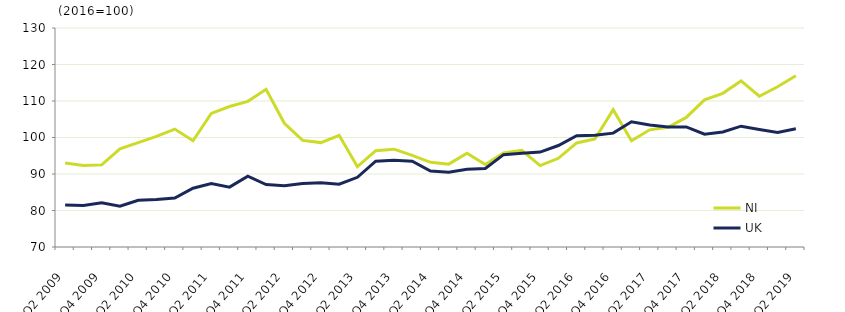
| Category | NI  | UK  |
|---|---|---|
| Q2 2009 | 93 | 81.5 |
|  | 92.3 | 81.4 |
| Q4 2009 | 92.5 | 82.1 |
|  | 96.9 | 81.2 |
| Q2 2010 | 98.6 | 82.8 |
|  | 100.3 | 83 |
| Q4 2010 | 102.3 | 83.4 |
|  | 99.1 | 86.1 |
| Q2 2011 | 106.6 | 87.4 |
|  | 108.5 | 86.4 |
| Q4 2011 | 109.9 | 89.4 |
|  | 113.2 | 87.1 |
| Q2 2012 | 103.9 | 86.8 |
|  | 99.2 | 87.4 |
| Q4 2012 | 98.6 | 87.6 |
|  | 100.6 | 87.2 |
| Q2 2013 | 92 | 89.1 |
|  | 96.4 | 93.5 |
| Q4 2013 | 96.8 | 93.8 |
|  | 95.1 | 93.5 |
| Q2 2014 | 93.2 | 90.8 |
|  | 92.7 | 90.5 |
| Q4 2014 | 95.7 | 91.3 |
|  | 92.6 | 91.5 |
| Q2 2015 | 95.8 | 95.3 |
|  | 96.5 | 95.7 |
| Q4 2015 | 92.3 | 96 |
|  | 94.3 | 97.8 |
| Q2 2016 | 98.5 | 100.5 |
|  | 99.6 | 100.6 |
| Q4 2016 | 107.6 | 101.2 |
|  | 99.1 | 104.3 |
| Q2 2017 | 102.1 | 103.4 |
|  | 102.8 | 102.9 |
| Q4 2017 | 105.5 | 102.9 |
|  | 110.3 | 100.9 |
| Q2 2018 | 112.1 | 101.5 |
|  | 115.5 | 103.1 |
| Q4 2018 | 111.3 | 102.2 |
|  | 113.9 | 101.4 |
| Q2 2019 | 116.9 | 102.4 |